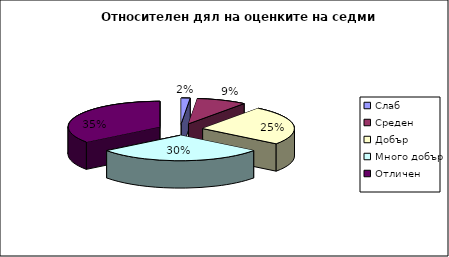
| Category | Series 0 |
|---|---|
| Слаб | 3 |
| Среден | 17 |
| Добър | 48 |
| Много добър | 57 |
| Отличен | 68 |